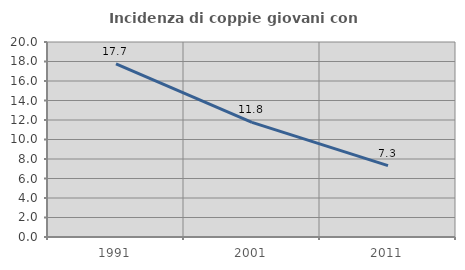
| Category | Incidenza di coppie giovani con figli |
|---|---|
| 1991.0 | 17.745 |
| 2001.0 | 11.755 |
| 2011.0 | 7.326 |